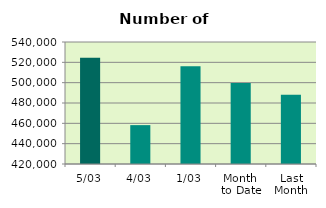
| Category | Series 0 |
|---|---|
| 5/03 | 524538 |
| 4/03 | 458240 |
| 1/03 | 516230 |
| Month 
to Date | 499669.333 |
| Last
Month | 488116.6 |